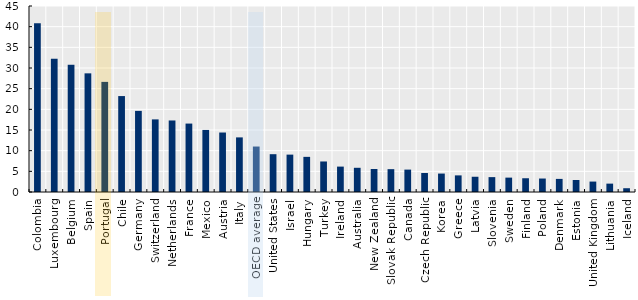
| Category | % of students who reported that they had repeated a grade at least once in primary, lower secondary or upper secondary school |
|---|---|
| Colombia | 40.827 |
| Luxembourg | 32.209 |
| Belgium | 30.783 |
| Spain | 28.707 |
| Portugal | 26.642 |
| Chile | 23.209 |
| Germany | 19.628 |
| Switzerland | 17.568 |
| Netherlands | 17.305 |
| France | 16.555 |
| Mexico | 15.014 |
| Austria | 14.391 |
| Italy | 13.212 |
| OECD average | 11 |
| United States | 9.146 |
| Israel | 9.045 |
| Hungary | 8.502 |
| Turkey | 7.385 |
| Ireland | 6.145 |
| Australia | 5.857 |
| New Zealand | 5.569 |
| Slovak Republic | 5.527 |
| Canada | 5.419 |
| Czech Republic | 4.593 |
| Korea | 4.462 |
| Greece | 4.02 |
| Latvia | 3.69 |
| Slovenia | 3.6 |
| Sweden | 3.479 |
| Finland | 3.327 |
| Poland | 3.26 |
| Denmark | 3.171 |
| Estonia | 2.904 |
| United Kingdom | 2.523 |
| Lithuania | 2.026 |
| Iceland | 0.913 |